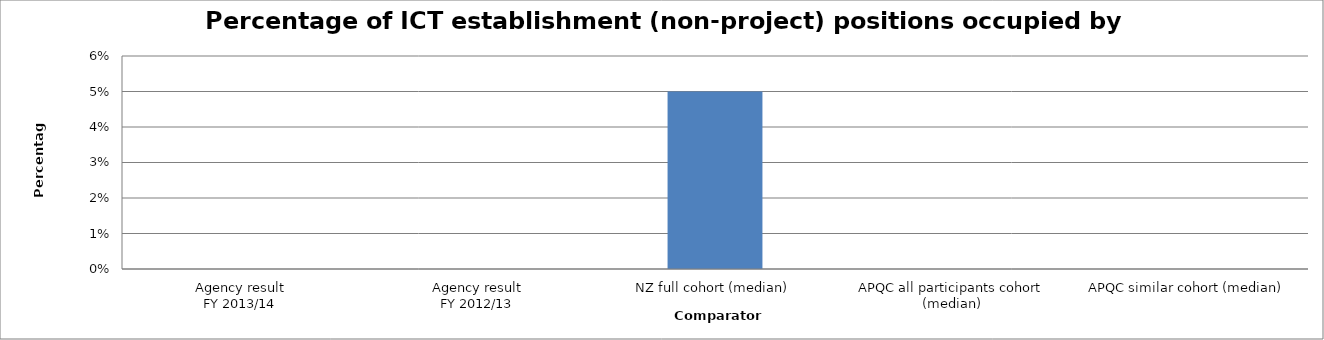
| Category | Result |
|---|---|
| Agency result
FY 2013/14 | 0 |
| Agency result
FY 2012/13 | 0 |
| NZ full cohort (median) | 0.05 |
| APQC all participants cohort (median) | 0 |
| APQC similar cohort (median) | 0 |